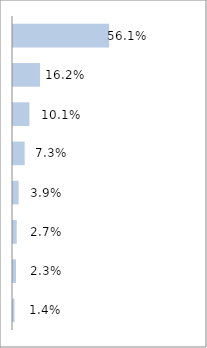
| Category | Series 0 |
|---|---|
| Excel School - Dashboards Membership | 0.561 |
| PM Templates for Excel [2007] | 0.162 |
| Excel School - Download Membership | 0.101 |
| Dashboard Tutorial #1 | 0.073 |
| PM Templates for Excel [both] | 0.039 |
| PM Templates for Excel [2003] | 0.027 |
| Excel School - Online Membership | 0.023 |
| Excel Formula e-book | 0.014 |